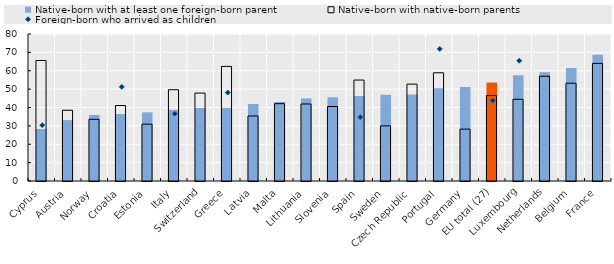
| Category | Native-born with at least one foreign-born parent | Native-born with native-born parents |
|---|---|---|
| Cyprus | 28.262 | 65.582 |
| Austria | 33.153 | 38.5 |
| Norway | 35.952 | 33.57 |
| Croatia | 36.472 | 41.052 |
| Estonia | 37.365 | 30.942 |
| Italy | 38.757 | 49.677 |
| Switzerland | 39.709 | 47.851 |
| Greece | 39.848 | 62.364 |
| Latvia | 41.891 | 35.385 |
| Malta | 43.061 | 42.083 |
| Lithuania | 44.958 | 41.912 |
| Slovenia | 45.594 | 40.538 |
| Spain | 46.229 | 54.945 |
| Sweden | 46.888 | 30.016 |
| Czech Republic | 47.069 | 52.727 |
| Portugal | 50.419 | 58.899 |
| Germany | 51.173 | 28.242 |
| EU total (27) | 53.575 | 46.498 |
| Luxembourg | 57.56 | 44.475 |
| Netherlands | 59.19 | 57.014 |
| Belgium | 61.541 | 53.212 |
| France | 68.667 | 64.019 |